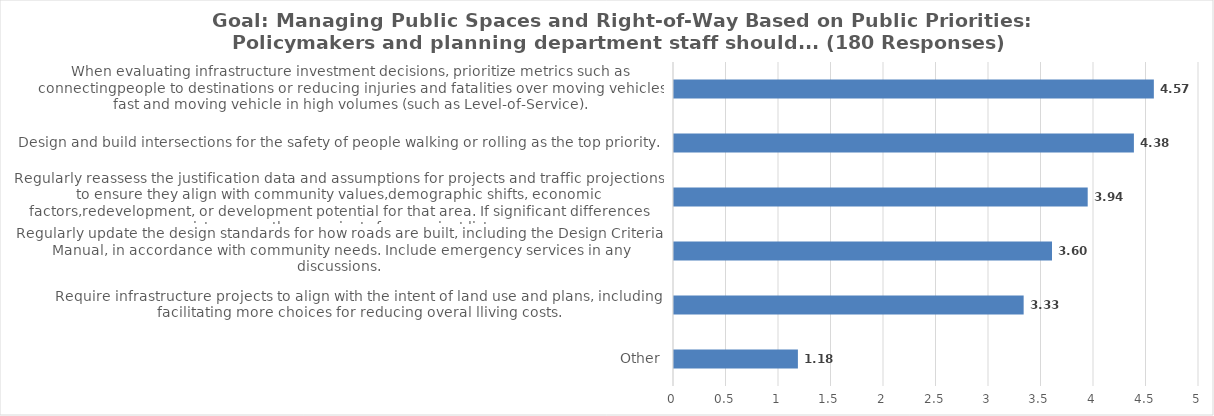
| Category | Score |
|---|---|
| Other | 1.18 |
| Require infrastructure projects to align with the intent of land use and plans, including facilitating more choices for reducing overal lliving costs. | 3.33 |
| Regularly update the design standards for how roads are built, including the Design Criteria Manual, in accordance with community needs. Include emergency services in any discussions. | 3.6 |
| Regularly reassess the justification data and assumptions for projects and traffic projections to ensure they align with community values,demographic shifts, economic factors,redevelopment, or development potential for that area. If significant differences | 3.94 |
| Design and build intersections for the safety of people walking or rolling as the top priority. | 4.38 |
| When evaluating infrastructure investment decisions, prioritize metrics such as connectingpeople to destinations or reducing injuries and fatalities over moving vehicles fast and moving vehicle in high volumes (such as Level-of-Service). | 4.57 |